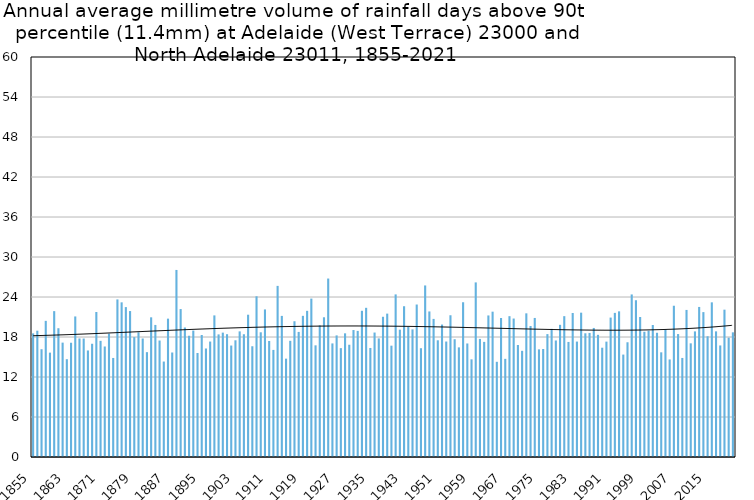
| Category | Annual average mm in days above 90th percentile |
|---|---|
| 1855 | 18.543 |
| 1856 | 18.947 |
| 1857 | 16.168 |
| 1858 | 20.423 |
| 1859 | 15.656 |
| 1860 | 21.88 |
| 1861 | 19.315 |
| 1862 | 17.157 |
| 1863 | 14.671 |
| 1864 | 17.138 |
| 1865 | 21.083 |
| 1866 | 17.782 |
| 1867 | 17.77 |
| 1868 | 15.982 |
| 1869 | 16.986 |
| 1870 | 21.75 |
| 1871 | 17.424 |
| 1872 | 16.577 |
| 1873 | 18.5 |
| 1874 | 14.856 |
| 1875 | 23.638 |
| 1876 | 23.2 |
| 1877 | 22.486 |
| 1878 | 21.892 |
| 1879 | 17.983 |
| 1880 | 18.71 |
| 1881 | 17.775 |
| 1882 | 15.729 |
| 1883 | 20.953 |
| 1884 | 19.811 |
| 1885 | 17.471 |
| 1886 | 14.32 |
| 1887 | 20.754 |
| 1888 | 15.675 |
| 1889 | 28.059 |
| 1890 | 22.192 |
| 1891 | 19.425 |
| 1892 | 18.19 |
| 1893 | 18.967 |
| 1894 | 15.6 |
| 1895 | 18.3 |
| 1896 | 16.277 |
| 1897 | 17.317 |
| 1898 | 21.242 |
| 1899 | 18.39 |
| 1900 | 18.656 |
| 1901 | 18.42 |
| 1902 | 16.72 |
| 1903 | 17.507 |
| 1904 | 18.845 |
| 1905 | 18.413 |
| 1906 | 21.344 |
| 1907 | 16.612 |
| 1908 | 24.108 |
| 1909 | 18.706 |
| 1910 | 22.136 |
| 1911 | 17.4 |
| 1912 | 16.064 |
| 1913 | 25.667 |
| 1914 | 21.167 |
| 1915 | 14.753 |
| 1916 | 17.429 |
| 1917 | 20.362 |
| 1918 | 18.762 |
| 1919 | 21.175 |
| 1920 | 21.925 |
| 1921 | 23.762 |
| 1922 | 16.75 |
| 1923 | 19.753 |
| 1924 | 20.958 |
| 1925 | 26.77 |
| 1926 | 17.038 |
| 1927 | 18.243 |
| 1928 | 16.329 |
| 1929 | 18.55 |
| 1930 | 16.84 |
| 1931 | 19.044 |
| 1932 | 18.915 |
| 1933 | 21.933 |
| 1934 | 22.378 |
| 1935 | 16.356 |
| 1936 | 18.67 |
| 1937 | 17.787 |
| 1938 | 21.033 |
| 1939 | 21.508 |
| 1940 | 16.7 |
| 1941 | 24.391 |
| 1942 | 19.1 |
| 1943 | 22.617 |
| 1944 | 19.525 |
| 1945 | 19.14 |
| 1946 | 22.873 |
| 1947 | 16.318 |
| 1948 | 25.733 |
| 1949 | 21.833 |
| 1950 | 20.714 |
| 1951 | 17.507 |
| 1952 | 19.867 |
| 1953 | 17.322 |
| 1954 | 21.262 |
| 1955 | 17.667 |
| 1956 | 16.444 |
| 1957 | 23.212 |
| 1958 | 17.03 |
| 1959 | 14.65 |
| 1960 | 26.189 |
| 1961 | 17.712 |
| 1962 | 17.27 |
| 1963 | 21.233 |
| 1964 | 21.8 |
| 1965 | 14.28 |
| 1966 | 20.85 |
| 1967 | 14.725 |
| 1968 | 21.125 |
| 1969 | 20.769 |
| 1970 | 16.8 |
| 1971 | 15.928 |
| 1972 | 21.55 |
| 1973 | 19.653 |
| 1974 | 20.857 |
| 1975 | 16.145 |
| 1976 | 16.2 |
| 1977 | 18.433 |
| 1978 | 19.225 |
| 1979 | 17.48 |
| 1980 | 19.829 |
| 1981 | 21.126 |
| 1982 | 17.26 |
| 1983 | 21.6 |
| 1984 | 17.314 |
| 1985 | 21.65 |
| 1986 | 18.556 |
| 1987 | 18.611 |
| 1988 | 19.357 |
| 1989 | 18.327 |
| 1990 | 16.393 |
| 1991 | 17.308 |
| 1992 | 20.913 |
| 1993 | 21.618 |
| 1994 | 21.85 |
| 1995 | 15.364 |
| 1996 | 17.212 |
| 1997 | 24.383 |
| 1998 | 23.517 |
| 1999 | 21 |
| 2000 | 18.788 |
| 2001 | 18.946 |
| 2002 | 19.8 |
| 2003 | 18.633 |
| 2004 | 15.7 |
| 2005 | 19.125 |
| 2006 | 14.633 |
| 2007 | 22.689 |
| 2008 | 18.44 |
| 2009 | 14.857 |
| 2010 | 22.06 |
| 2011 | 17.05 |
| 2012 | 18.843 |
| 2013 | 22.509 |
| 2014 | 21.733 |
| 2015 | 18.111 |
| 2016 | 23.2 |
| 2017 | 18.846 |
| 2018 | 16.733 |
| 2019 | 22.1 |
| 2020 | 17.9 |
| 2021 | 18.7 |